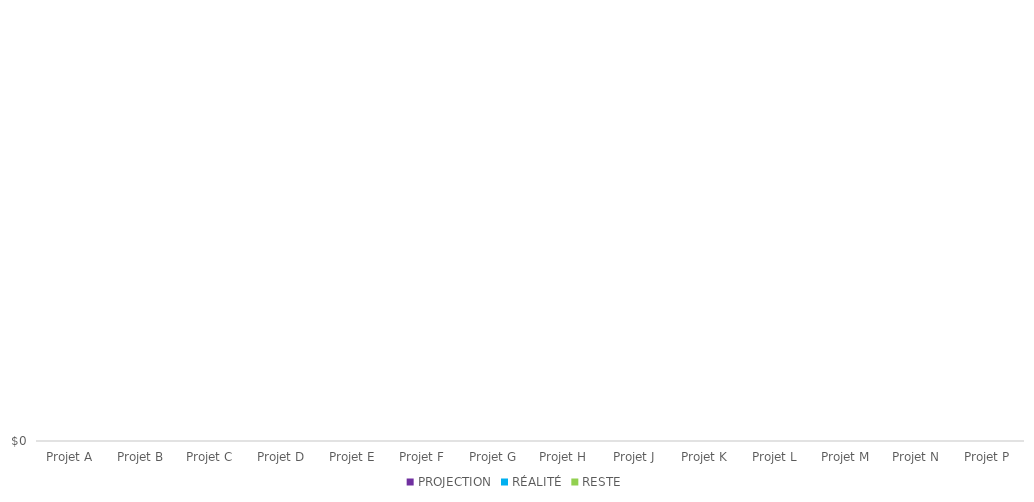
| Category | PROJECTION | RÉALITÉ | RESTE |
|---|---|---|---|
| Projet A |  |  | 0 |
| Projet B |  |  | 0 |
| Projet C |  |  | 0 |
| Projet D |  |  | 0 |
| Projet E |  |  | 0 |
| Projet F |  |  | 0 |
| Projet G |  |  | 0 |
| Projet H |  |  | 0 |
| Projet J |  |  | 0 |
| Projet K |  |  | 0 |
| Projet L |  |  | 0 |
| Projet M |  |  | 0 |
| Projet N |  |  | 0 |
| Projet P |  |  | 0 |